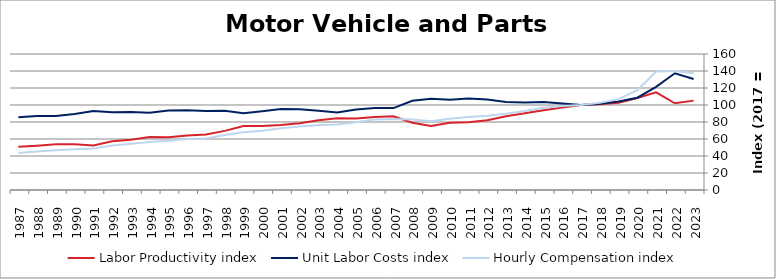
| Category | Labor Productivity index | Unit Labor Costs index | Hourly Compensation index |
|---|---|---|---|
| 2023.0 | 105.153 | 130.6 | 137.33 |
| 2022.0 | 102.012 | 137.325 | 140.088 |
| 2021.0 | 114.848 | 121.313 | 139.326 |
| 2020.0 | 108.255 | 108.559 | 117.52 |
| 2019.0 | 102.713 | 104.115 | 106.94 |
| 2018.0 | 101.011 | 101.484 | 102.51 |
| 2017.0 | 100 | 100 | 100 |
| 2016.0 | 97.058 | 101.755 | 98.762 |
| 2015.0 | 93.706 | 103.39 | 96.883 |
| 2014.0 | 90.235 | 103.049 | 92.987 |
| 2013.0 | 86.814 | 103.422 | 89.784 |
| 2012.0 | 82.025 | 106.472 | 87.334 |
| 2011.0 | 79.789 | 107.575 | 85.833 |
| 2010.0 | 79.023 | 106.234 | 83.95 |
| 2009.0 | 75.292 | 107.416 | 80.875 |
| 2008.0 | 79.081 | 104.88 | 82.94 |
| 2007.0 | 86.71 | 96.335 | 83.533 |
| 2006.0 | 85.891 | 96.485 | 82.871 |
| 2005.0 | 84.132 | 94.837 | 79.788 |
| 2004.0 | 84.292 | 91.302 | 76.961 |
| 2003.0 | 82.085 | 93.208 | 76.509 |
| 2002.0 | 78.605 | 94.992 | 74.668 |
| 2001.0 | 76.335 | 95.15 | 72.633 |
| 2000.0 | 75.232 | 92.774 | 69.795 |
| 1999.0 | 75.221 | 90.29 | 67.917 |
| 1998.0 | 69.547 | 93.12 | 64.762 |
| 1997.0 | 65.235 | 92.985 | 60.659 |
| 1996.0 | 63.99 | 93.872 | 60.068 |
| 1995.0 | 61.941 | 93.444 | 57.88 |
| 1994.0 | 62.243 | 90.782 | 56.505 |
| 1993.0 | 59.092 | 91.875 | 54.291 |
| 1992.0 | 57.217 | 91.475 | 52.339 |
| 1991.0 | 52.492 | 92.908 | 48.769 |
| 1990.0 | 53.694 | 89.535 | 48.075 |
| 1989.0 | 53.768 | 87.133 | 46.85 |
| 1988.0 | 52.163 | 87.074 | 45.42 |
| 1987.0 | 50.785 | 85.534 | 43.439 |